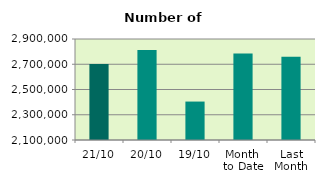
| Category | Series 0 |
|---|---|
| 21/10 | 2702010 |
| 20/10 | 2813576 |
| 19/10 | 2404488 |
| Month 
to Date | 2784819.467 |
| Last
Month | 2759252.364 |